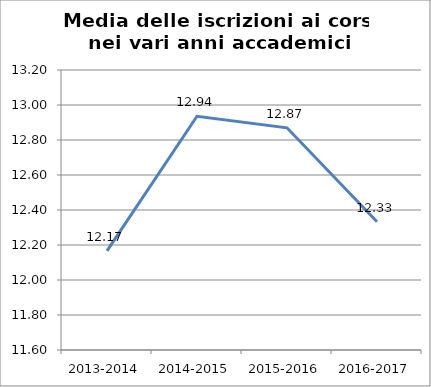
| Category | Media delle iscrizioni ai Corsi |
|---|---|
| 2013-2014 | 12.167 |
| 2014-2015 | 12.935 |
| 2015-2016 | 12.87 |
| 2016-2017 | 12.333 |